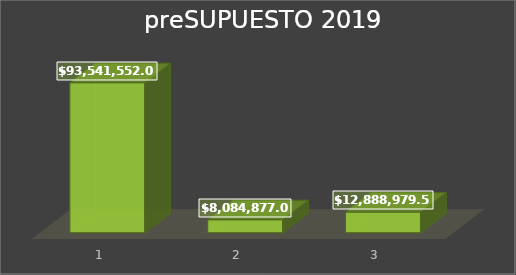
| Category | Series 0 |
|---|---|
| 0 | 93541552 |
| 1 | 8084877 |
| 2 | 12888979.55 |